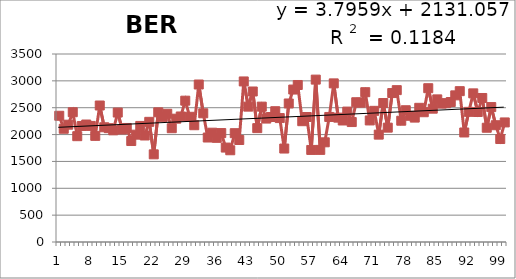
| Category | 1913-2012 |
|---|---|
| 0 | 2350 |
| 1 | 2108 |
| 2 | 2184 |
| 3 | 2416 |
| 4 | 1970 |
| 5 | 2160 |
| 6 | 2187 |
| 7 | 2161 |
| 8 | 1976 |
| 9 | 2541 |
| 10 | 2136 |
| 11 | 2119 |
| 12 | 2079 |
| 13 | 2410 |
| 14 | 2094 |
| 15 | 2123 |
| 16 | 1880 |
| 17 | 1998 |
| 18 | 2161 |
| 19 | 1983 |
| 20 | 2237 |
| 21 | 1632 |
| 22 | 2414 |
| 23 | 2329 |
| 24 | 2387 |
| 25 | 2118 |
| 26 | 2296 |
| 27 | 2337 |
| 28 | 2631 |
| 29 | 2331 |
| 30 | 2174 |
| 31 | 2932 |
| 32 | 2396 |
| 33 | 1945 |
| 34 | 2035 |
| 35 | 1939 |
| 36 | 2028 |
| 37 | 1758 |
| 38 | 1708 |
| 39 | 2026 |
| 40 | 1899 |
| 41 | 2989 |
| 42 | 2520 |
| 43 | 2802 |
| 44 | 2120 |
| 45 | 2520 |
| 46 | 2298 |
| 47 | 2327 |
| 48 | 2435 |
| 49 | 2307 |
| 50 | 1740 |
| 51 | 2579 |
| 52 | 2838 |
| 53 | 2923 |
| 54 | 2249 |
| 55 | 2327 |
| 56 | 1714 |
| 57 | 3023 |
| 58 | 1715 |
| 59 | 1856 |
| 60 | 2328 |
| 61 | 2953 |
| 62 | 2315 |
| 63 | 2262 |
| 64 | 2428 |
| 65 | 2233 |
| 66 | 2602 |
| 67 | 2593 |
| 68 | 2789 |
| 69 | 2263 |
| 70 | 2442 |
| 71 | 1999 |
| 72 | 2587 |
| 73 | 2129 |
| 74 | 2773 |
| 75 | 2827 |
| 76 | 2258 |
| 77 | 2453 |
| 78 | 2350 |
| 79 | 2316 |
| 80 | 2498 |
| 81 | 2416 |
| 82 | 2863 |
| 83 | 2482 |
| 84 | 2655 |
| 85 | 2577 |
| 86 | 2584 |
| 87 | 2606 |
| 88 | 2730 |
| 89 | 2808 |
| 90 | 2039 |
| 91 | 2423 |
| 92 | 2767 |
| 93 | 2420 |
| 94 | 2681 |
| 95 | 2127 |
| 96 | 2512 |
| 97 | 2174 |
| 98 | 1917 |
| 99 | 2226 |